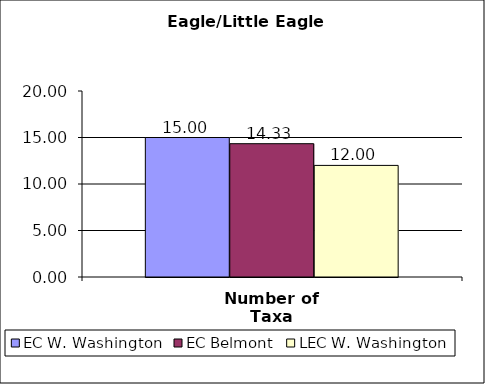
| Category | EC W. Washington | EC Belmont | LEC W. Washington |
|---|---|---|---|
| Number of Taxa | 15 | 14.333 | 12 |